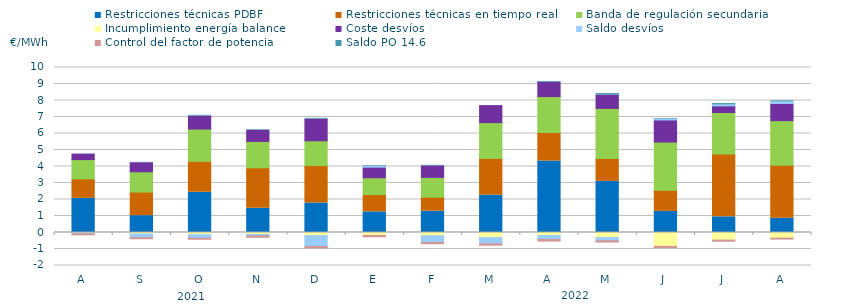
| Category | Restricciones técnicas PDBF | Restricciones técnicas en tiempo real | Banda de regulación secundaria | Incumplimiento energía balance | Coste desvíos | Saldo desvíos | Control del factor de potencia | Saldo PO 14.6 |
|---|---|---|---|---|---|---|---|---|
| A | 2.07 | 1.18 | 1.17 | -0.03 | 0.33 | -0.05 | -0.06 | 0.01 |
| S | 1.02 | 1.43 | 1.23 | -0.09 | 0.55 | -0.23 | -0.06 | 0.02 |
| O | 2.44 | 1.87 | 1.96 | -0.13 | 0.78 | -0.21 | -0.07 | 0.05 |
| N | 1.47 | 2.45 | 1.6 | -0.12 | 0.67 | -0.09 | -0.08 | 0.04 |
| D | 1.79 | 2.27 | 1.5 | -0.19 | 1.31 | -0.66 | -0.08 | 0.05 |
| E | 1.25 | 1.05 | 1.02 | -0.18 | 0.64 | 0.04 | -0.08 | 0.04 |
| F | 1.29 | 0.85 | 1.2 | -0.2 | 0.7 | -0.41 | -0.07 | 0.03 |
| M | 2.26 | 2.23 | 2.17 | -0.31 | 1.03 | -0.38 | -0.08 | 0 |
| A | 4.33 | 1.73 | 2.18 | -0.18 | 0.86 | -0.25 | -0.09 | 0.05 |
| M | 3.1 | 1.39 | 3.03 | -0.31 | 0.81 | -0.19 | -0.08 | 0.09 |
| J | 1.28 | 1.28 | 2.92 | -0.84 | 1.34 | 0.05 | -0.07 | 0.04 |
| J | 0.95 | 3.81 | 2.514 | -0.46 | 0.4 | 0.05 | -0.07 | 0.09 |
| A | 0.87 | 3.21 | 2.7 | -0.34 | 1.04 | 0.09 | -0.06 | 0.07 |